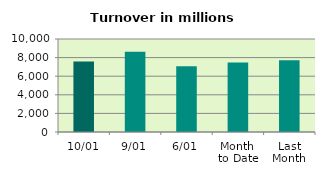
| Category | Series 0 |
|---|---|
| 10/01 | 7587.824 |
| 9/01 | 8630.975 |
| 6/01 | 7057.623 |
| Month 
to Date | 7467.335 |
| Last
Month | 7707.734 |